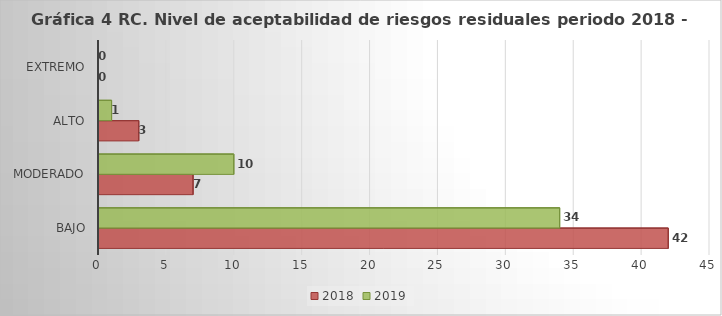
| Category | 2018 | 2019 |
|---|---|---|
| Bajo | 42 | 34 |
| Moderado | 7 | 10 |
| Alto | 3 | 1 |
| Extremo | 0 | 0 |